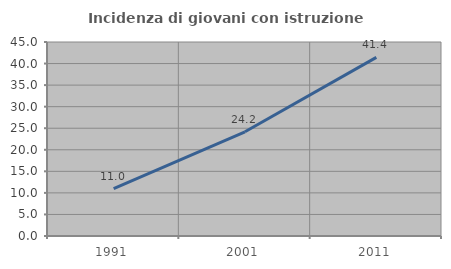
| Category | Incidenza di giovani con istruzione universitaria |
|---|---|
| 1991.0 | 11 |
| 2001.0 | 24.176 |
| 2011.0 | 41.429 |